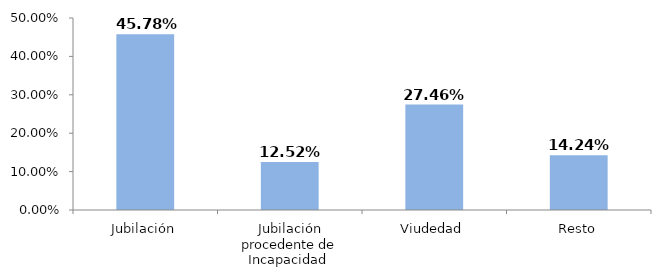
| Category | Series 0 |
|---|---|
| Jubilación | 0.458 |
| Jubilación procedente de Incapacidad  | 0.125 |
| Viudedad | 0.275 |
| Resto | 0.142 |